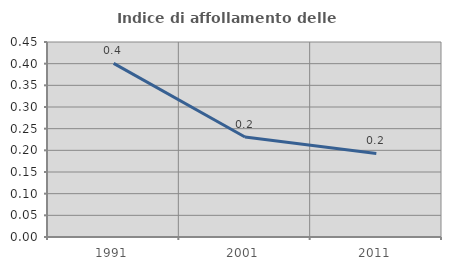
| Category | Indice di affollamento delle abitazioni  |
|---|---|
| 1991.0 | 0.401 |
| 2001.0 | 0.231 |
| 2011.0 | 0.193 |